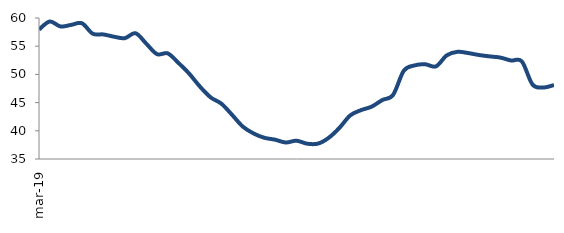
| Category | Series 0 |
|---|---|
| 2019-03-01 | 57.946 |
| 2019-04-01 | 59.379 |
| 2019-05-01 | 58.501 |
| 2019-06-01 | 58.778 |
| 2019-07-01 | 59.07 |
| 2019-08-01 | 57.226 |
| 2019-09-01 | 57.084 |
| 2019-10-01 | 56.682 |
| 2019-11-01 | 56.425 |
| 2019-12-01 | 57.298 |
| 2020-01-01 | 55.449 |
| 2020-02-01 | 53.592 |
| 2020-03-01 | 53.724 |
| 2020-04-01 | 52.032 |
| 2020-05-01 | 50.132 |
| 2020-06-01 | 47.839 |
| 2020-07-01 | 45.923 |
| 2020-08-01 | 44.807 |
| 2020-09-01 | 42.819 |
| 2020-10-01 | 40.739 |
| 2020-11-01 | 39.526 |
| 2020-12-01 | 38.764 |
| 2021-01-01 | 38.426 |
| 2021-02-01 | 37.926 |
| 2021-03-01 | 38.241 |
| 2021-04-01 | 37.709 |
| 2021-05-01 | 37.728 |
| 2021-06-01 | 38.756 |
| 2021-07-01 | 40.518 |
| 2021-08-01 | 42.719 |
| 2021-09-01 | 43.654 |
| 2021-10-01 | 44.278 |
| 2021-11-01 | 45.454 |
| 2021-12-01 | 46.366 |
| 2022-01-01 | 50.644 |
| 2022-02-01 | 51.594 |
| 2022-03-01 | 51.797 |
| 2022-04-01 | 51.424 |
| 2022-05-01 | 53.368 |
| 2022-06-01 | 54.005 |
| 2022-07-01 | 53.784 |
| 2022-08-01 | 53.439 |
| 2022-09-01 | 53.193 |
| 2022-10-01 | 52.983 |
| 2022-11-01 | 52.462 |
| 2022-12-01 | 52.307 |
| 2023-01-01 | 48.201 |
| 2023-02-01 | 47.68 |
| 2023-03-01 | 48.113 |